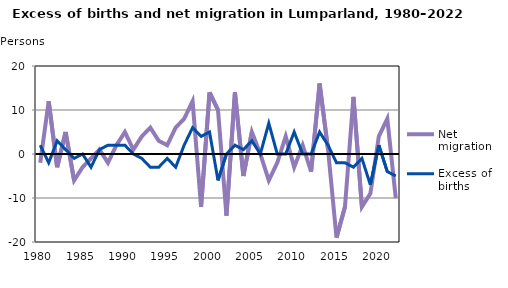
| Category | Net migration | Excess of births |
|---|---|---|
| 1980.0 | -2 | 2 |
| 1981.0 | 12 | -2 |
| 1982.0 | -3 | 3 |
| 1983.0 | 5 | 1 |
| 1984.0 | -6 | -1 |
| 1985.0 | -3 | 0 |
| 1986.0 | -1 | -3 |
| 1987.0 | 1 | 1 |
| 1988.0 | -2 | 2 |
| 1989.0 | 2 | 2 |
| 1990.0 | 5 | 2 |
| 1991.0 | 1 | 0 |
| 1992.0 | 4 | -1 |
| 1993.0 | 6 | -3 |
| 1994.0 | 3 | -3 |
| 1995.0 | 2 | -1 |
| 1996.0 | 6 | -3 |
| 1997.0 | 8 | 2 |
| 1998.0 | 12 | 6 |
| 1999.0 | -12 | 4 |
| 2000.0 | 14 | 5 |
| 2001.0 | 10 | -6 |
| 2002.0 | -14 | 0 |
| 2003.0 | 14 | 2 |
| 2004.0 | -5 | 1 |
| 2005.0 | 5 | 3 |
| 2006.0 | 0 | 0 |
| 2007.0 | -6 | 7 |
| 2008.0 | -2 | 0 |
| 2009.0 | 4 | 0 |
| 2010.0 | -3 | 5 |
| 2011.0 | 2 | 0 |
| 2012.0 | -4 | 0 |
| 2013.0 | 16 | 5 |
| 2014.0 | 1 | 2 |
| 2015.0 | -19 | -2 |
| 2016.0 | -12 | -2 |
| 2017.0 | 13 | -3 |
| 2018.0 | -12 | -1 |
| 2019.0 | -9 | -7 |
| 2020.0 | 4 | 2 |
| 2021.0 | 8 | -4 |
| 2022.0 | -10 | -5 |